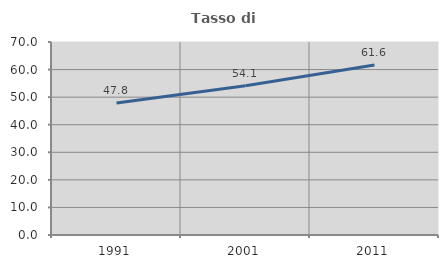
| Category | Tasso di occupazione   |
|---|---|
| 1991.0 | 47.846 |
| 2001.0 | 54.119 |
| 2011.0 | 61.633 |